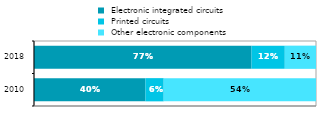
| Category |  Electronic integrated circuits |  Printed circuits |  Other electronic components |
|---|---|---|---|
| 2010 | 0.395 | 0.065 | 0.54 |
| 2018 | 0.771 | 0.118 | 0.111 |